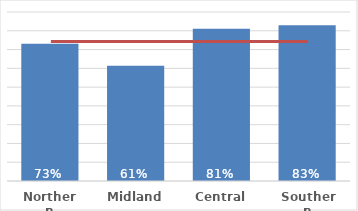
| Category | Pacific |
|---|---|
| Northern | 0.731 |
| Midland | 0.614 |
| Central | 0.81 |
| Southern | 0.829 |